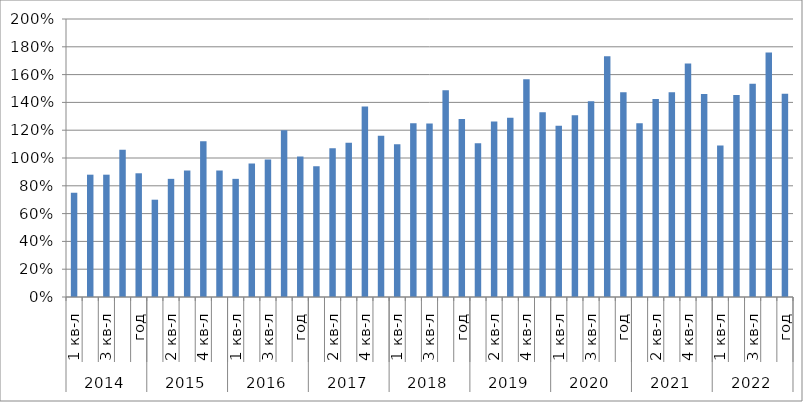
| Category | Series 0 |
|---|---|
| 0 | 0.75 |
| 1 | 0.88 |
| 2 | 0.88 |
| 3 | 1.06 |
| 4 | 0.89 |
| 5 | 0.7 |
| 6 | 0.85 |
| 7 | 0.91 |
| 8 | 1.12 |
| 9 | 0.91 |
| 10 | 0.85 |
| 11 | 0.96 |
| 12 | 0.99 |
| 13 | 1.2 |
| 14 | 1.01 |
| 15 | 0.94 |
| 16 | 1.07 |
| 17 | 1.11 |
| 18 | 1.37 |
| 19 | 1.16 |
| 20 | 1.099 |
| 21 | 1.249 |
| 22 | 1.249 |
| 23 | 1.487 |
| 24 | 1.281 |
| 25 | 1.107 |
| 26 | 1.262 |
| 27 | 1.29 |
| 28 | 1.566 |
| 29 | 1.33 |
| 30 | 1.232 |
| 31 | 1.307 |
| 32 | 1.407 |
| 33 | 1.732 |
| 34 | 1.473 |
| 35 | 1.251 |
| 36 | 1.424 |
| 37 | 1.473 |
| 38 | 1.68 |
| 39 | 1.461 |
| 40 | 1.091 |
| 41 | 1.453 |
| 42 | 1.535 |
| 43 | 1.759 |
| 44 | 1.462 |